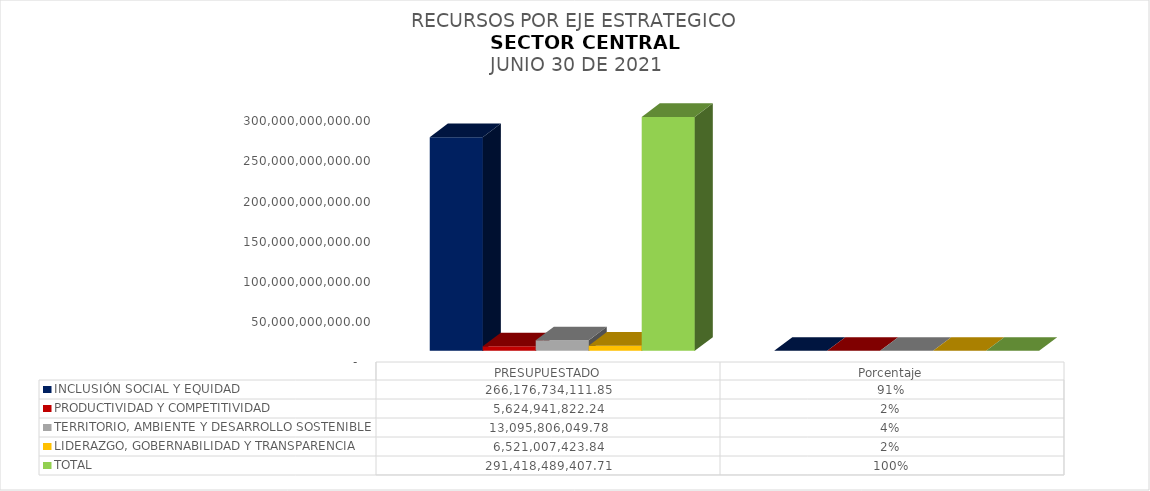
| Category | INCLUSIÓN SOCIAL Y EQUIDAD  | PRODUCTIVIDAD Y COMPETITIVIDAD | TERRITORIO, AMBIENTE Y DESARROLLO SOSTENIBLE  | LIDERAZGO, GOBERNABILIDAD Y TRANSPARENCIA  | TOTAL |
|---|---|---|---|---|---|
| PRESUPUESTADO | 266176734111.85 | 5624941822.24 | 13095806049.78 | 6521007423.84 | 291418489407.71 |
| Porcentaje | 0.913 | 0.019 | 0.045 | 0.022 | 1 |